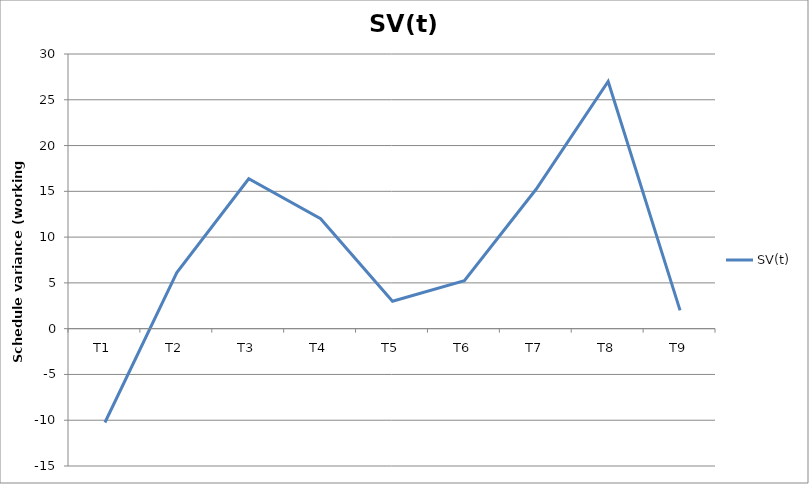
| Category | SV(t) |
|---|---|
| T1 | -10.25 |
| T2 | 6.125 |
| T3 | 16.375 |
| T4 | 12 |
| T5 | 3 |
| T6 | 5.25 |
| T7 | 15.25 |
| T8 | 27 |
| T9 | 2 |